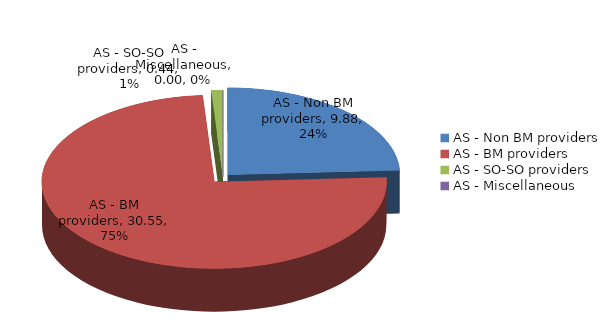
| Category | Series 0 |
|---|---|
| AS - Non BM providers | 9.883 |
| AS - BM providers | 30.553 |
| AS - SO-SO providers | 0.441 |
| AS - Miscellaneous | 0.004 |